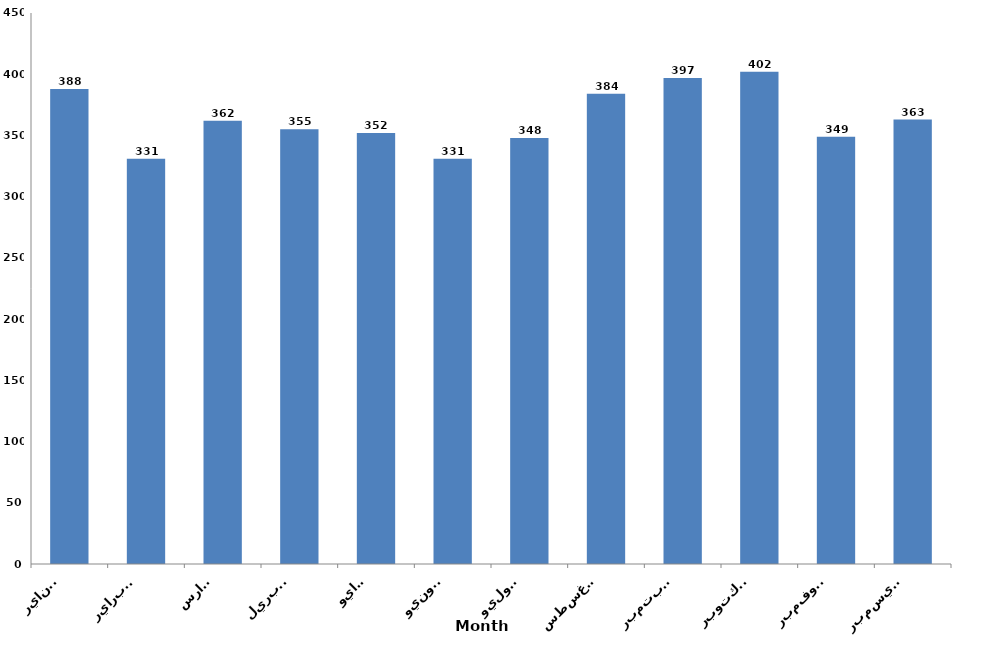
| Category | الشهور
 Month |
|---|---|
| يناير
January | 388 |
| فبراير
February | 331 |
| مارس
March | 362 |
| ابريل
April | 355 |
| مايو
May | 352 |
| يونيو
June | 331 |
| يوليو
July | 348 |
| اغسطس
August | 384 |
| سبتمبر
September | 397 |
| اكتوبر
October | 402 |
| نوفمبر
November | 349 |
| ديسمبر
December | 363 |